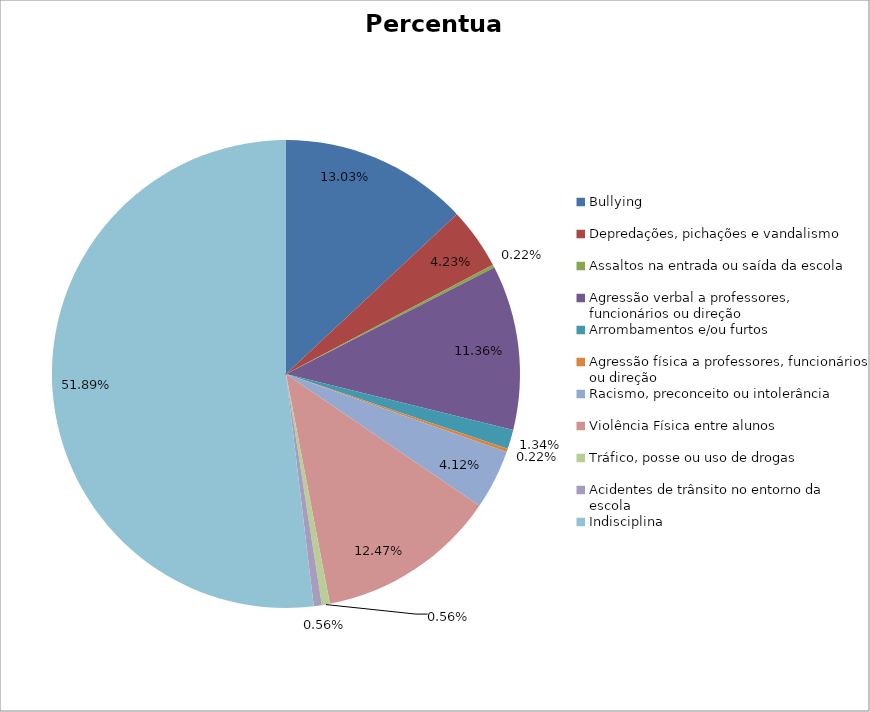
| Category | Percentual |
|---|---|
| Bullying | 0.13 |
| Depredações, pichações e vandalismo | 0.042 |
| Assaltos na entrada ou saída da escola | 0.002 |
| Agressão verbal a professores, funcionários ou direção | 0.114 |
| Arrombamentos e/ou furtos | 0.013 |
| Agressão física a professores, funcionários ou direção | 0.002 |
| Racismo, preconceito ou intolerância | 0.041 |
| Violência Física entre alunos | 0.125 |
| Tráfico, posse ou uso de drogas | 0.006 |
| Acidentes de trânsito no entorno da escola | 0.006 |
| Indisciplina | 0.519 |